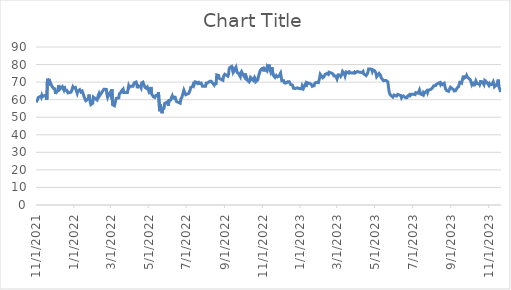
| Category | Series 0 |
|---|---|
| 11/1/21 | 58.44 |
| 11/2/21 | 59.35 |
| 11/3/21 | 59.93 |
| 11/4/21 | 61.16 |
| 11/5/21 | 61.54 |
| 11/8/21 | 61.98 |
| 11/9/21 | 61.33 |
| 11/10/21 | 62.56 |
| 11/11/21 | 61.75 |
| 11/12/21 | 61.19 |
| 11/15/21 | 62.4 |
| 11/16/21 | 62.42 |
| 11/17/21 | 61.57 |
| 11/18/21 | 59.97 |
| 11/19/21 | 71.93 |
| 11/22/21 | 69.61 |
| 11/23/21 | 70.35 |
| 11/24/21 | 69.42 |
| 11/26/21 | 67.71 |
| 11/29/21 | 66.34 |
| 11/30/21 | 65.9 |
| 12/1/21 | 66.15 |
| 12/2/21 | 63.27 |
| 12/3/21 | 64.38 |
| 12/6/21 | 65.03 |
| 12/7/21 | 68.29 |
| 12/8/21 | 68.07 |
| 12/9/21 | 66 |
| 12/10/21 | 65.6 |
| 12/13/21 | 67.41 |
| 12/14/21 | 66.55 |
| 12/15/21 | 65.82 |
| 12/16/21 | 67.8 |
| 12/17/21 | 65.27 |
| 12/20/21 | 65.45 |
| 12/21/21 | 64.81 |
| 12/22/21 | 63.89 |
| 12/23/21 | 64.13 |
| 12/27/21 | 64.26 |
| 12/28/21 | 64.99 |
| 12/29/21 | 66.32 |
| 12/30/21 | 67.27 |
| 12/31/21 | 66.62 |
| 1/3/22 | 66.97 |
| 1/4/22 | 65.69 |
| 1/5/22 | 65.51 |
| 1/6/22 | 63.64 |
| 1/7/22 | 64.85 |
| 1/10/22 | 65.69 |
| 1/11/22 | 66.25 |
| 1/12/22 | 64.35 |
| 1/13/22 | 64.6 |
| 1/14/22 | 64.88 |
| 1/18/22 | 60.83 |
| 1/19/22 | 59.99 |
| 1/20/22 | 59.4 |
| 1/21/22 | 59.32 |
| 1/24/22 | 60.52 |
| 1/25/22 | 62.89 |
| 1/26/22 | 60.87 |
| 1/27/22 | 58.7 |
| 1/28/22 | 57.2 |
| 1/31/22 | 57.93 |
| 2/1/22 | 61.47 |
| 2/2/22 | 61.66 |
| 2/3/22 | 60.93 |
| 2/4/22 | 60.91 |
| 2/7/22 | 59.85 |
| 2/8/22 | 59.98 |
| 2/9/22 | 62.56 |
| 2/10/22 | 63.4 |
| 2/11/22 | 62.16 |
| 2/14/22 | 63.77 |
| 2/15/22 | 64.32 |
| 2/16/22 | 64.89 |
| 2/17/22 | 64.55 |
| 2/18/22 | 65.93 |
| 2/22/22 | 65.84 |
| 2/23/22 | 62.8 |
| 2/24/22 | 61.38 |
| 2/25/22 | 62.32 |
| 2/28/22 | 64.02 |
| 3/1/22 | 62.87 |
| 3/2/22 | 63.38 |
| 3/3/22 | 65.88 |
| 3/4/22 | 57.17 |
| 3/7/22 | 56.54 |
| 3/8/22 | 57.8 |
| 3/9/22 | 59.6 |
| 3/10/22 | 60.77 |
| 3/11/22 | 60.23 |
| 3/14/22 | 61.02 |
| 3/15/22 | 63.42 |
| 3/16/22 | 63.46 |
| 3/17/22 | 63.92 |
| 3/18/22 | 64.79 |
| 3/21/22 | 65.99 |
| 3/22/22 | 64.08 |
| 3/23/22 | 64.49 |
| 3/24/22 | 64.14 |
| 3/25/22 | 64.44 |
| 3/28/22 | 64.12 |
| 3/29/22 | 66.01 |
| 3/30/22 | 67.86 |
| 3/31/22 | 67.02 |
| 4/1/22 | 67.61 |
| 4/4/22 | 67.63 |
| 4/5/22 | 67.71 |
| 4/6/22 | 67.67 |
| 4/7/22 | 67.99 |
| 4/8/22 | 69.63 |
| 4/11/22 | 70.08 |
| 4/12/22 | 69.06 |
| 4/13/22 | 66.52 |
| 4/14/22 | 68.05 |
| 4/18/22 | 67.37 |
| 4/19/22 | 66.74 |
| 4/20/22 | 69.56 |
| 4/21/22 | 69.84 |
| 4/22/22 | 69.98 |
| 4/25/22 | 67.2 |
| 4/26/22 | 67.31 |
| 4/27/22 | 66.57 |
| 4/28/22 | 67.11 |
| 4/29/22 | 67.25 |
| 5/2/22 | 64.35 |
| 5/3/22 | 64.56 |
| 5/4/22 | 65.4 |
| 5/5/22 | 67.25 |
| 5/6/22 | 63.21 |
| 5/9/22 | 61.68 |
| 5/10/22 | 61.96 |
| 5/11/22 | 61.25 |
| 5/12/22 | 61 |
| 5/13/22 | 62.41 |
| 5/16/22 | 62.34 |
| 5/17/22 | 64.33 |
| 5/18/22 | 63.81 |
| 5/19/22 | 53.42 |
| 5/20/22 | 57.39 |
| 5/23/22 | 52.29 |
| 5/24/22 | 54.57 |
| 5/25/22 | 54.43 |
| 5/26/22 | 55.03 |
| 5/27/22 | 57.86 |
| 5/31/22 | 58.63 |
| 6/1/22 | 57.87 |
| 6/2/22 | 56.62 |
| 6/3/22 | 59.57 |
| 6/6/22 | 59.79 |
| 6/7/22 | 61.25 |
| 6/8/22 | 61.98 |
| 6/9/22 | 60.28 |
| 6/10/22 | 61.65 |
| 6/13/22 | 61.36 |
| 6/14/22 | 60.07 |
| 6/15/22 | 58.99 |
| 6/16/22 | 59.3 |
| 6/17/22 | 58.61 |
| 6/21/22 | 57.98 |
| 6/22/22 | 60.13 |
| 6/23/22 | 60.02 |
| 6/24/22 | 61.54 |
| 6/27/22 | 65.43 |
| 6/28/22 | 65.19 |
| 6/29/22 | 63.62 |
| 6/30/22 | 62.82 |
| 7/1/22 | 62.32 |
| 7/5/22 | 63.63 |
| 7/6/22 | 64.68 |
| 7/7/22 | 65.25 |
| 7/8/22 | 66.96 |
| 7/11/22 | 67.51 |
| 7/12/22 | 68.61 |
| 7/13/22 | 68.04 |
| 7/14/22 | 68.16 |
| 7/15/22 | 70.16 |
| 7/18/22 | 69.87 |
| 7/19/22 | 69.29 |
| 7/20/22 | 68.95 |
| 7/21/22 | 69.77 |
| 7/22/22 | 69.14 |
| 7/25/22 | 69.46 |
| 7/26/22 | 68.95 |
| 7/27/22 | 67.66 |
| 7/28/22 | 67.98 |
| 7/29/22 | 67.69 |
| 8/1/22 | 67.7 |
| 8/2/22 | 69.42 |
| 8/3/22 | 69.24 |
| 8/4/22 | 69.48 |
| 8/5/22 | 69.36 |
| 8/8/22 | 70.5 |
| 8/9/22 | 70.98 |
| 8/10/22 | 70.51 |
| 8/11/22 | 70.81 |
| 8/12/22 | 69.56 |
| 8/15/22 | 68.29 |
| 8/16/22 | 69.11 |
| 8/17/22 | 69.24 |
| 8/18/22 | 69.13 |
| 8/19/22 | 74.09 |
| 8/22/22 | 73.78 |
| 8/23/22 | 72.21 |
| 8/24/22 | 72.22 |
| 8/25/22 | 71.72 |
| 8/26/22 | 72.02 |
| 8/29/22 | 71.05 |
| 8/30/22 | 73.3 |
| 8/31/22 | 73.33 |
| 9/1/22 | 74.49 |
| 9/2/22 | 74.48 |
| 9/6/22 | 73.37 |
| 9/7/22 | 74.35 |
| 9/8/22 | 77.56 |
| 9/9/22 | 78.32 |
| 9/12/22 | 78.91 |
| 9/13/22 | 78.46 |
| 9/14/22 | 76.08 |
| 9/15/22 | 77.17 |
| 9/16/22 | 76.45 |
| 9/19/22 | 78.45 |
| 9/20/22 | 76.92 |
| 9/21/22 | 75.5 |
| 9/22/22 | 75.63 |
| 9/23/22 | 75 |
| 9/26/22 | 73.11 |
| 9/27/22 | 75.45 |
| 9/28/22 | 76.02 |
| 9/29/22 | 76.06 |
| 9/30/22 | 74.47 |
| 10/3/22 | 72.81 |
| 10/4/22 | 74.92 |
| 10/5/22 | 74.47 |
| 10/6/22 | 72.25 |
| 10/7/22 | 71.32 |
| 10/10/22 | 70.21 |
| 10/11/22 | 69.73 |
| 10/12/22 | 72.32 |
| 10/13/22 | 71.6 |
| 10/14/22 | 72.21 |
| 10/17/22 | 71.03 |
| 10/18/22 | 71.43 |
| 10/19/22 | 72.66 |
| 10/20/22 | 71.94 |
| 10/21/22 | 70.24 |
| 10/24/22 | 71.2 |
| 10/25/22 | 71.72 |
| 10/26/22 | 74.2 |
| 10/27/22 | 75.03 |
| 10/28/22 | 76.46 |
| 10/31/22 | 77.81 |
| 11/1/22 | 77.4 |
| 11/2/22 | 77.83 |
| 11/3/22 | 76.1 |
| 11/4/22 | 77.67 |
| 11/7/22 | 76.69 |
| 11/8/22 | 78.2 |
| 11/9/22 | 77.25 |
| 11/10/22 | 77.59 |
| 11/11/22 | 80.01 |
| 11/14/22 | 76.13 |
| 11/15/22 | 76.16 |
| 11/16/22 | 78.47 |
| 11/17/22 | 78.36 |
| 11/18/22 | 74.01 |
| 11/21/22 | 72.69 |
| 11/22/22 | 73.13 |
| 11/23/22 | 73.78 |
| 11/25/22 | 72.98 |
| 11/28/22 | 73.5 |
| 11/29/22 | 74.56 |
| 11/30/22 | 75.17 |
| 12/1/22 | 75.24 |
| 12/2/22 | 70.73 |
| 12/5/22 | 70.81 |
| 12/6/22 | 69.64 |
| 12/7/22 | 69.75 |
| 12/8/22 | 69.41 |
| 12/9/22 | 69.83 |
| 12/12/22 | 70.28 |
| 12/13/22 | 70.81 |
| 12/14/22 | 70.25 |
| 12/15/22 | 70.33 |
| 12/16/22 | 68.66 |
| 12/19/22 | 68.38 |
| 12/20/22 | 67.96 |
| 12/21/22 | 66.47 |
| 12/22/22 | 66.86 |
| 12/23/22 | 66.35 |
| 12/27/22 | 66.75 |
| 12/28/22 | 66.33 |
| 12/29/22 | 66.41 |
| 12/30/22 | 65.96 |
| 1/3/23 | 66.16 |
| 1/4/23 | 67.89 |
| 1/5/23 | 67.54 |
| 1/6/23 | 66.54 |
| 1/9/23 | 68.82 |
| 1/10/23 | 67.3 |
| 1/11/23 | 67.05 |
| 1/12/23 | 69.71 |
| 1/13/23 | 69.35 |
| 1/17/23 | 69.05 |
| 1/18/23 | 69.08 |
| 1/19/23 | 68.53 |
| 1/20/23 | 67.64 |
| 1/23/23 | 67.93 |
| 1/24/23 | 69.24 |
| 1/25/23 | 69.42 |
| 1/26/23 | 69.8 |
| 1/27/23 | 69.66 |
| 1/30/23 | 69.7 |
| 1/31/23 | 69.82 |
| 2/1/23 | 72.47 |
| 2/2/23 | 74.46 |
| 2/3/23 | 74.33 |
| 2/6/23 | 72.48 |
| 2/7/23 | 72.89 |
| 2/8/23 | 73.08 |
| 2/9/23 | 72.76 |
| 2/10/23 | 74.51 |
| 2/13/23 | 74.89 |
| 2/14/23 | 74.96 |
| 2/15/23 | 74.39 |
| 2/16/23 | 75.65 |
| 2/17/23 | 75.39 |
| 2/21/23 | 75.01 |
| 2/22/23 | 75.17 |
| 2/23/23 | 74.43 |
| 2/24/23 | 73.54 |
| 2/27/23 | 73.47 |
| 2/28/23 | 72.96 |
| 3/1/23 | 71.8 |
| 3/2/23 | 71.89 |
| 3/3/23 | 74.14 |
| 3/6/23 | 73.96 |
| 3/7/23 | 73.28 |
| 3/8/23 | 73.61 |
| 3/9/23 | 74.31 |
| 3/10/23 | 76.06 |
| 3/13/23 | 74.78 |
| 3/14/23 | 73.59 |
| 3/15/23 | 74.86 |
| 3/16/23 | 75.78 |
| 3/17/23 | 75.85 |
| 3/20/23 | 75.12 |
| 3/21/23 | 75.85 |
| 3/22/23 | 76.08 |
| 3/23/23 | 75.29 |
| 3/24/23 | 75.13 |
| 3/27/23 | 75.18 |
| 3/28/23 | 75.16 |
| 3/29/23 | 75.75 |
| 3/30/23 | 75.17 |
| 3/31/23 | 74.74 |
| 4/3/23 | 76.07 |
| 4/4/23 | 76.52 |
| 4/5/23 | 75.75 |
| 4/6/23 | 76.24 |
| 4/10/23 | 75.44 |
| 4/11/23 | 75.98 |
| 4/12/23 | 76.13 |
| 4/13/23 | 74.78 |
| 4/14/23 | 74.78 |
| 4/17/23 | 73.72 |
| 4/18/23 | 73.67 |
| 4/19/23 | 74.82 |
| 4/20/23 | 75.79 |
| 4/21/23 | 77.51 |
| 4/24/23 | 77.51 |
| 4/25/23 | 78.07 |
| 4/26/23 | 77.24 |
| 4/27/23 | 76.08 |
| 4/28/23 | 76.99 |
| 5/1/23 | 76.37 |
| 5/2/23 | 76.06 |
| 5/3/23 | 74.96 |
| 5/4/23 | 73.09 |
| 5/5/23 | 73.46 |
| 5/8/23 | 74.95 |
| 5/9/23 | 74.9 |
| 5/10/23 | 73.98 |
| 5/11/23 | 72.73 |
| 5/12/23 | 72.11 |
| 5/15/23 | 70.8 |
| 5/16/23 | 70.92 |
| 5/17/23 | 70.94 |
| 5/18/23 | 71.35 |
| 5/19/23 | 70.93 |
| 5/22/23 | 70.13 |
| 5/23/23 | 69.6 |
| 5/24/23 | 64.55 |
| 5/25/23 | 63.52 |
| 5/26/23 | 62.77 |
| 5/30/23 | 61.45 |
| 5/31/23 | 61.5 |
| 6/1/23 | 62.65 |
| 6/2/23 | 62.18 |
| 6/5/23 | 62.05 |
| 6/6/23 | 62.56 |
| 6/7/23 | 63.01 |
| 6/8/23 | 63.2 |
| 6/9/23 | 62.74 |
| 6/12/23 | 62.3 |
| 6/13/23 | 61.1 |
| 6/14/23 | 61.69 |
| 6/15/23 | 62.2 |
| 6/16/23 | 62.13 |
| 6/20/23 | 61.07 |
| 6/21/23 | 61.24 |
| 6/22/23 | 61.21 |
| 6/23/23 | 62.11 |
| 6/26/23 | 62.89 |
| 6/27/23 | 62.32 |
| 6/28/23 | 62.62 |
| 6/29/23 | 63.04 |
| 6/30/23 | 62.55 |
| 7/3/23 | 63.01 |
| 7/5/23 | 62.84 |
| 7/6/23 | 64 |
| 7/7/23 | 64.26 |
| 7/10/23 | 63.75 |
| 7/11/23 | 64.66 |
| 7/12/23 | 65.54 |
| 7/13/23 | 65.4 |
| 7/14/23 | 63.15 |
| 7/17/23 | 62.73 |
| 7/18/23 | 63.75 |
| 7/19/23 | 63 |
| 7/20/23 | 63.75 |
| 7/21/23 | 64.14 |
| 7/24/23 | 65.11 |
| 7/25/23 | 64.11 |
| 7/26/23 | 65.22 |
| 7/27/23 | 64.99 |
| 7/28/23 | 65.54 |
| 7/31/23 | 66.03 |
| 8/1/23 | 66.31 |
| 8/2/23 | 66.8 |
| 8/3/23 | 66.77 |
| 8/4/23 | 67.88 |
| 8/7/23 | 68.02 |
| 8/8/23 | 68.65 |
| 8/9/23 | 68.35 |
| 8/10/23 | 69.1 |
| 8/11/23 | 69.15 |
| 8/14/23 | 69.75 |
| 8/15/23 | 68.73 |
| 8/16/23 | 69.34 |
| 8/17/23 | 69.21 |
| 8/18/23 | 68.57 |
| 8/21/23 | 69.31 |
| 8/22/23 | 69.74 |
| 8/23/23 | 66.16 |
| 8/24/23 | 66.2 |
| 8/25/23 | 65.14 |
| 8/28/23 | 64.76 |
| 8/29/23 | 64.72 |
| 8/30/23 | 66.37 |
| 8/31/23 | 67.07 |
| 9/1/23 | 67.39 |
| 9/5/23 | 65.71 |
| 9/6/23 | 64.99 |
| 9/7/23 | 65.25 |
| 9/8/23 | 65.04 |
| 9/11/23 | 66.79 |
| 9/12/23 | 66.89 |
| 9/13/23 | 67.38 |
| 9/14/23 | 67.46 |
| 9/15/23 | 69.83 |
| 9/18/23 | 69.38 |
| 9/19/23 | 71.15 |
| 9/20/23 | 71.51 |
| 9/21/23 | 73.65 |
| 9/22/23 | 72.22 |
| 9/25/23 | 72.89 |
| 9/26/23 | 73.76 |
| 9/27/23 | 72.92 |
| 9/28/23 | 72.96 |
| 9/29/23 | 72.29 |
| 10/2/23 | 71.37 |
| 10/3/23 | 71.04 |
| 10/4/23 | 69.1 |
| 10/5/23 | 70.15 |
| 10/6/23 | 68.34 |
| 10/9/23 | 68.37 |
| 10/10/23 | 69.46 |
| 10/11/23 | 70.68 |
| 10/12/23 | 70.18 |
| 10/13/23 | 69.14 |
| 10/16/23 | 69.11 |
| 10/17/23 | 68.5 |
| 10/18/23 | 69.51 |
| 10/19/23 | 71.02 |
| 10/20/23 | 69.79 |
| 10/23/23 | 69.27 |
| 10/24/23 | 68.65 |
| 10/25/23 | 70.45 |
| 10/26/23 | 69.88 |
| 10/27/23 | 70.47 |
| 10/30/23 | 69.21 |
| 10/31/23 | 68.75 |
| 11/1/23 | 68.12 |
| 11/2/23 | 69.03 |
| 11/3/23 | 68.41 |
| 11/6/23 | 68.76 |
| 11/7/23 | 69.15 |
| 11/8/23 | 70.17 |
| 11/9/23 | 68.91 |
| 11/10/23 | 67.31 |
| 11/13/23 | 68.3 |
| 11/14/23 | 68.87 |
| 11/15/23 | 69.82 |
| 11/16/23 | 71.43 |
| 11/17/23 | 67.6 |
| 11/20/23 | 64.35 |